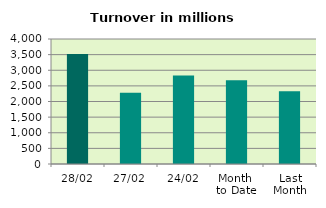
| Category | Series 0 |
|---|---|
| 28/02 | 3517.018 |
| 27/02 | 2279.589 |
| 24/02 | 2834.56 |
| Month 
to Date | 2679.99 |
| Last
Month | 2326.675 |